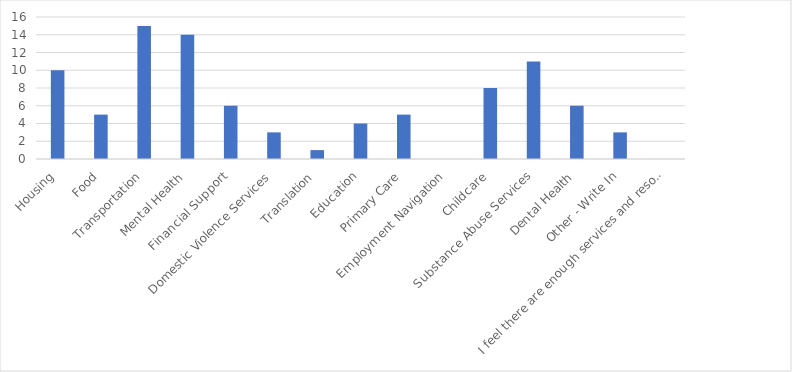
| Category | Number of Responses |
|---|---|
| Housing | 10 |
| Food | 5 |
| Transportation | 15 |
| Mental Health | 14 |
| Financial Support | 6 |
| Domestic Violence Services | 3 |
| Translation | 1 |
| Education | 4 |
| Primary Care | 5 |
| Employment Navigation | 0 |
| Childcare | 8 |
| Substance Abuse Services | 11 |
| Dental Health | 6 |
| Other - Write In | 3 |
| I feel there are enough services and resources to refer my patients/clients to. | 0 |